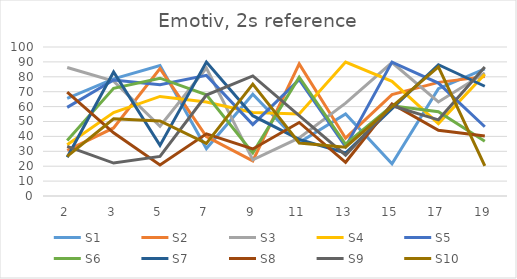
| Category | S1 | S2 | S3 | S4 | S5 | S6 | S7 | S8 | S9 | S10 |
|---|---|---|---|---|---|---|---|---|---|---|
| 2.0 | 65.53 | 30.58 | 86.27 | 34.45 | 59.46 | 37.29 | 26.06 | 69.66 | 33.32 | 26.54 |
| 3.0 | 78.57 | 45.67 | 77.08 | 56.05 | 77.85 | 72.32 | 83.24 | 42.39 | 22.1 | 51.85 |
| 5.0 | 87.5 | 85.48 | 46.78 | 66.82 | 74.71 | 79.06 | 33.98 | 20.89 | 26.58 | 50.33 |
| 7.0 | 31.85 | 39.93 | 85.82 | 63.04 | 80.97 | 67.86 | 89.84 | 41.7 | 67.72 | 35.27 |
| 9.0 | 68.31 | 23.55 | 24.26 | 55.99 | 47.95 | 28.96 | 53.89 | 31.55 | 80.56 | 75.1 |
| 11.0 | 35.83 | 88.62 | 39.01 | 55.02 | 78.13 | 79.7 | 38.04 | 49.35 | 53.89 | 35.54 |
| 13.0 | 55.08 | 38.8 | 62.36 | 89.85 | 33.07 | 34.72 | 28.84 | 22.64 | 27.39 | 32.8 |
| 15.0 | 21.58 | 68.01 | 89.57 | 76.93 | 89.86 | 60.56 | 58.54 | 61.79 | 60.6 | 60.04 |
| 17.0 | 72.03 | 76.27 | 63.13 | 48.56 | 75.76 | 56.53 | 88.08 | 44.16 | 51.1 | 86.65 |
| 19.0 | 85.29 | 80.12 | 82.55 | 81.74 | 46.46 | 36.68 | 73.65 | 40.24 | 86.6 | 20.21 |